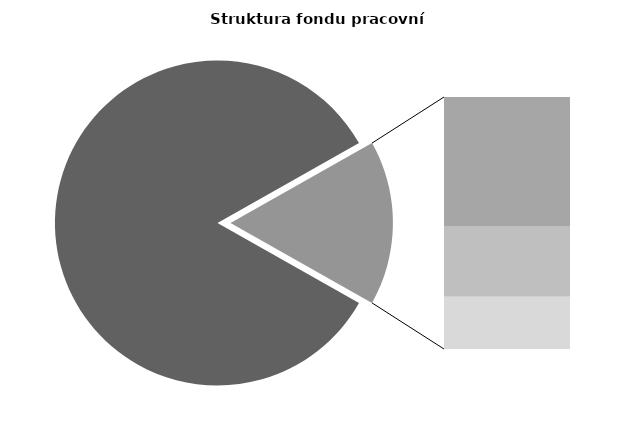
| Category | Series 0 |
|---|---|
| Průměrná měsíční odpracovaná doba bez přesčasu | 141.642 |
| Dovolená | 14.185 |
| Nemoc | 7.787 |
| Jiné | 5.735 |